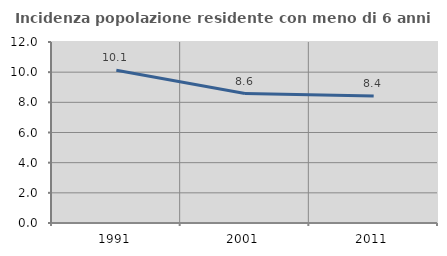
| Category | Incidenza popolazione residente con meno di 6 anni |
|---|---|
| 1991.0 | 10.124 |
| 2001.0 | 8.585 |
| 2011.0 | 8.413 |